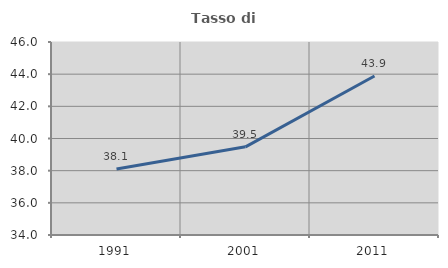
| Category | Tasso di occupazione   |
|---|---|
| 1991.0 | 38.097 |
| 2001.0 | 39.481 |
| 2011.0 | 43.889 |